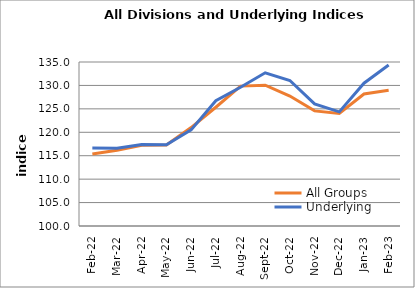
| Category | All Groups | Underlying |
|---|---|---|
| 2022-02-01 | 115.348 | 116.622 |
| 2022-03-01 | 116.161 | 116.584 |
| 2022-04-01 | 117.224 | 117.408 |
| 2022-05-01 | 117.307 | 117.326 |
| 2022-06-01 | 121.013 | 120.516 |
| 2022-07-01 | 125.348 | 126.726 |
| 2022-08-01 | 129.854 | 129.6 |
| 2022-09-01 | 130.056 | 132.699 |
| 2022-10-01 | 127.726 | 131.059 |
| 2022-11-01 | 124.568 | 126.047 |
| 2022-12-01 | 124.011 | 124.359 |
| 2023-01-01 | 128.161 | 130.471 |
| 2023-02-01 | 128.981 | 134.372 |